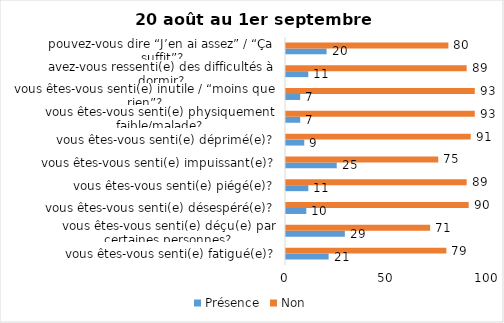
| Category | Présence | Non |
|---|---|---|
| vous êtes-vous senti(e) fatigué(e)? | 21 | 79 |
| vous êtes-vous senti(e) déçu(e) par certaines personnes? | 29 | 71 |
| vous êtes-vous senti(e) désespéré(e)? | 10 | 90 |
| vous êtes-vous senti(e) piégé(e)? | 11 | 89 |
| vous êtes-vous senti(e) impuissant(e)? | 25 | 75 |
| vous êtes-vous senti(e) déprimé(e)? | 9 | 91 |
| vous êtes-vous senti(e) physiquement faible/malade? | 7 | 93 |
| vous êtes-vous senti(e) inutile / “moins que rien”? | 7 | 93 |
| avez-vous ressenti(e) des difficultés à dormir? | 11 | 89 |
| pouvez-vous dire “J’en ai assez” / “Ça suffit”? | 20 | 80 |